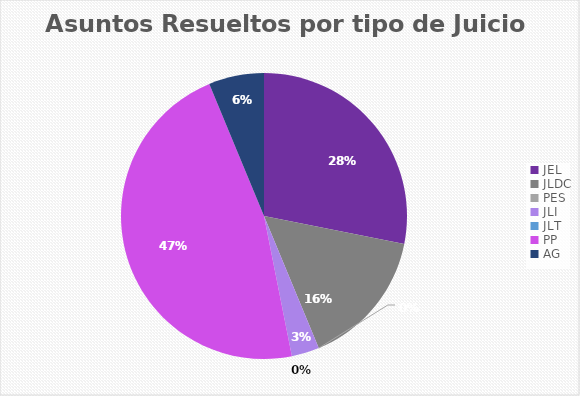
| Category | Asuntos Resueltos por tipo de Juicio  ABRIL |
|---|---|
| JEL | 9 |
| JLDC | 5 |
| PES | 0 |
| JLI | 1 |
| JLT | 0 |
| PP | 15 |
| AG | 2 |